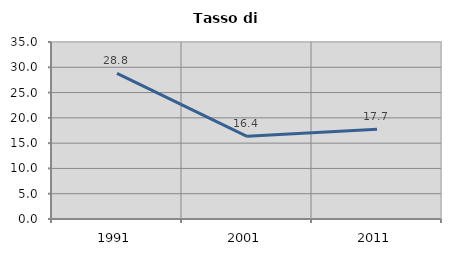
| Category | Tasso di disoccupazione   |
|---|---|
| 1991.0 | 28.795 |
| 2001.0 | 16.351 |
| 2011.0 | 17.727 |